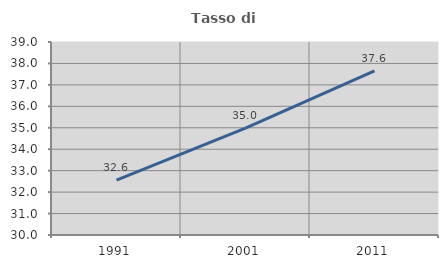
| Category | Tasso di occupazione   |
|---|---|
| 1991.0 | 32.563 |
| 2001.0 | 34.985 |
| 2011.0 | 37.649 |